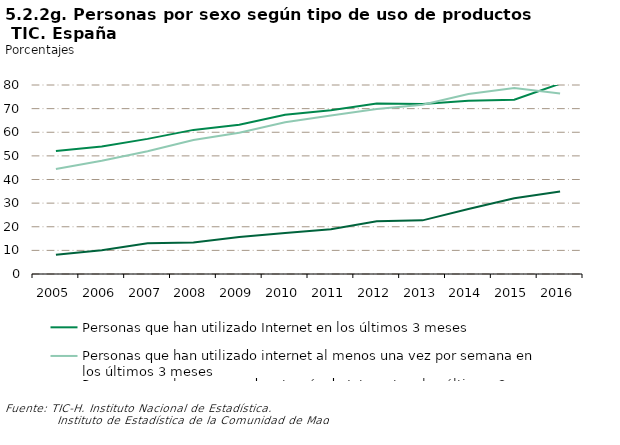
| Category | Personas que han utilizado Internet en los últimos 3 meses | Personas que han utilizado internet al menos una vez por semana en los últimos 3 meses | Personas que han comprado a través de Internet en los últimos 3 meses |
|---|---|---|---|
| 2005.0 | 52.1 | 44.4 | 8.1 |
| 2006.0 | 54 | 47.9 | 10.1 |
| 2007.0 | 57.2 | 52 | 13 |
| 2008.0 | 61 | 56.7 | 13.3 |
| 2009.0 | 63.2 | 59.8 | 15.7 |
| 2010.0 | 67.4 | 64.2 | 17.4 |
| 2011.0 | 69.3 | 67.1 | 18.9 |
| 2012.0 | 72.2 | 69.8 | 22.3 |
| 2013.0 | 72 | 71.6 | 22.7 |
| 2014.0 | 73.323 | 76.187 | 27.531 |
| 2015.0 | 73.802 | 78.69 | 32.066 |
| 2016.0 | 80.561 | 76.45 | 34.899 |